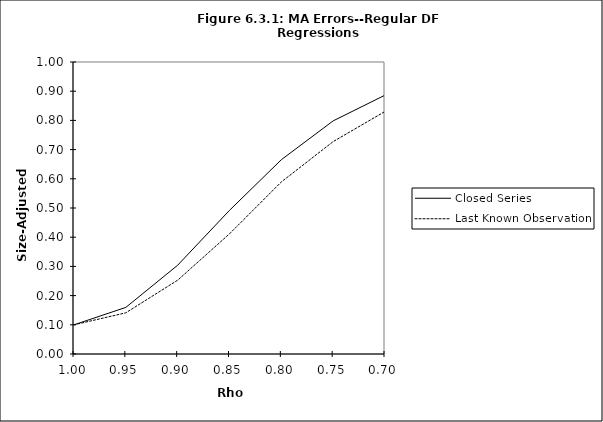
| Category | Closed Series | Last Known Observation |
|---|---|---|
| 1.0 | 0.1 | 0.1 |
| 0.95 | 0.16 | 0.141 |
| 0.9 | 0.304 | 0.253 |
| 0.85 | 0.492 | 0.412 |
| 0.8 | 0.665 | 0.589 |
| 0.75 | 0.798 | 0.727 |
| 0.7 | 0.886 | 0.831 |